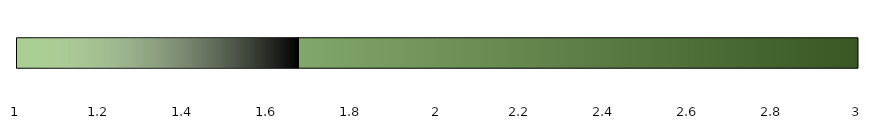
| Category | Series 1 |
|---|---|
| 0 | 3 |